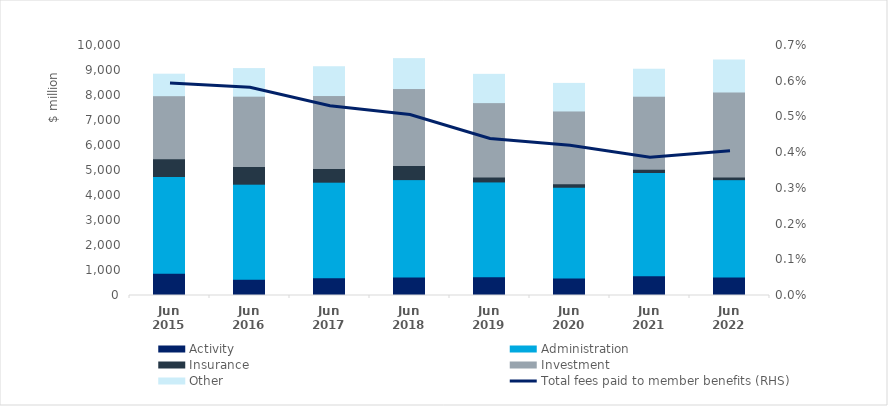
| Category | Activity | Administration | Insurance | Investment | Other |
|---|---|---|---|---|---|
| Jun 2015 | 894 | 3867 | 712 | 2519 | 860 |
| Jun 2016 | 648 | 3804 | 705 | 2816 | 1104 |
| Jun 2017 | 710 | 3822 | 548 | 2918 | 1152 |
| Jun 2018 | 741 | 3894 | 566 | 3077 | 1196 |
| Jun 2019 | 746 | 3796 | 196 | 2977 | 1131 |
| Jun 2020 | 697 | 3633 | 139 | 2912 | 1103 |
| Jun 2021 | 795 | 4125 | 127 | 2924 | 1080 |
| Jun 2022 | 739 | 3894 | 108 | 3396 | 1284 |